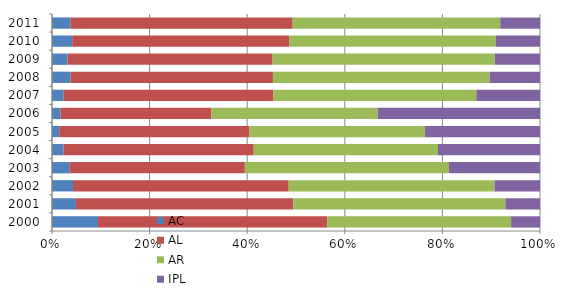
| Category | AC | AL | AR | IPL |
|---|---|---|---|---|
| 2000 | 55.533 | 277.134 | 222.265 | 34.961 |
| 2001 | 27.449 | 249.37 | 243.318 | 39.718 |
| 2002 | 23.972 | 246.402 | 235.008 | 51.995 |
| 2003 | 18.43 | 187.055 | 217.503 | 96.966 |
| 2004 | 12.909 | 213.72 | 206.947 | 114.64 |
| 2005 | 8.536 | 224.52 | 206.99 | 135.59 |
| 2006 | 10.543 | 187.769 | 206.789 | 201.822 |
| 2007 | 10.972 | 200.719 | 193.96 | 60.91 |
| 2008 | 18.318 | 200.737 | 214.812 | 49.966 |
| 2009 | 15.26 | 200.906 | 217.647 | 44.236 |
| 2010 | 19.742 | 212.829 | 201.923 | 43.339 |
| 2011 | 17.421 | 211.146 | 197.095 | 37.783 |